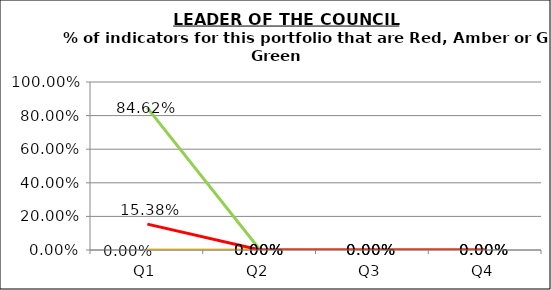
| Category | Green | Amber | Red |
|---|---|---|---|
| Q1 | 0.846 | 0 | 0.154 |
| Q2 | 0 | 0 | 0 |
| Q3 | 0 | 0 | 0 |
| Q4 | 0 | 0 | 0 |